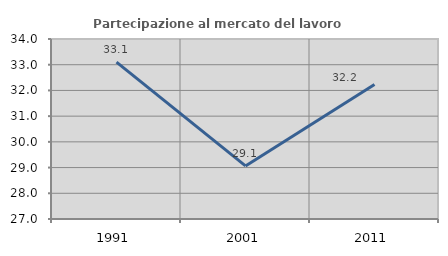
| Category | Partecipazione al mercato del lavoro  femminile |
|---|---|
| 1991.0 | 33.102 |
| 2001.0 | 29.065 |
| 2011.0 | 32.233 |